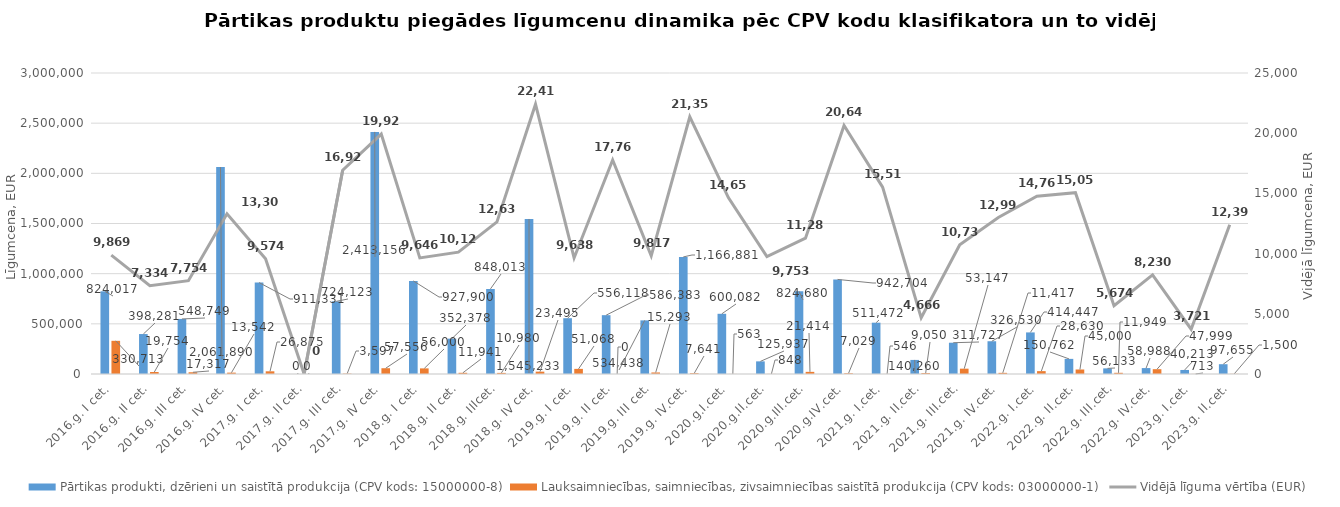
| Category | Pārtikas produkti, dzērieni un saistītā produkcija (CPV kods: 15000000-8) | Lauksaimniecības, saimniecības, zivsaimniecības saistītā produkcija (CPV kods: 03000000-1) |
|---|---|---|
| 2016.g. I cet. | 824017 | 330713 |
| 2016.g. II cet. | 398281 | 19754 |
| 2016.g. III cet. | 548749.01 | 17317 |
| 2016.g. IV cet. | 2061890 | 13542 |
| 2017.g. I cet. | 911330.81 | 26874.91 |
| 2017.g. II cet. | 0 | 0 |
| 2017.g. III cet. | 724123.07 | 3596.6 |
| 2017.g. IV cet. | 2413156 | 57556 |
| 2018.g. I cet. | 927900 | 56000 |
| 2018.g. II cet. | 352378 | 11941 |
| 2018.g. IIIcet. | 848013 | 10980 |
| 2018.g. IV cet. | 1545233 | 23495 |
| 2019.g. I cet. | 556118 | 51068 |
| 2019.g. II cet. | 586383 | 0 |
| 2019.g. III cet. | 534438 | 15293 |
| 2019.g. IV.cet. | 1166881 | 7641 |
| 2020.g.I.cet. | 600082 | 563 |
| 2020.g.II.cet. | 125937 | 848 |
| 2020.g.III.cet. | 824680 | 21414 |
| 2020.g.IV.cet. | 942704 | 7029 |
| 2021.g. I.cet. | 511472 | 546 |
| 2021.g. II.cet. | 140260 | 9050 |
| 2021.g. III.cet. | 311727 | 53147 |
| 2021.g. IV.cet. | 326530 | 11417 |
| 2022.g. I.cet. | 414447 | 28630 |
| 2022.g. II.cet. | 150762 | 45000 |
| 2022.g. III.cet. | 56133 | 11949 |
| 2022.g. IV.cet. | 58988 | 47999 |
| 2023.g. I.cet. | 40213 | 713 |
| 2023.g. II.cet. | 97655 | 1500 |